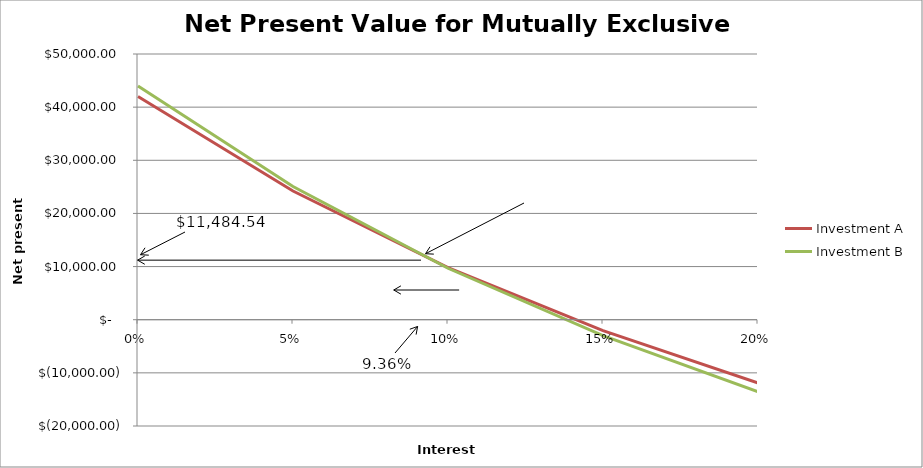
| Category | Investment A | Investment B |
|---|---|---|
| 0.0 | 42000 | 44000 |
| 0.05 | 24217.374 | 25071.087 |
| 0.1 | 9799.07 | 9683.703 |
| 0.15 | -2044.701 | -2988.307 |
| 0.2 | -11889.146 | -13547.454 |